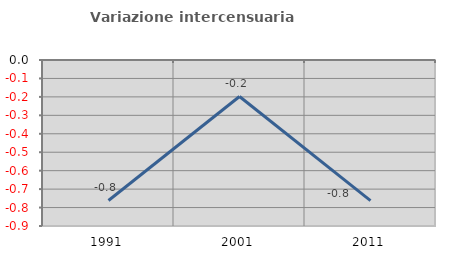
| Category | Variazione intercensuaria annua |
|---|---|
| 1991.0 | -0.762 |
| 2001.0 | -0.198 |
| 2011.0 | -0.762 |